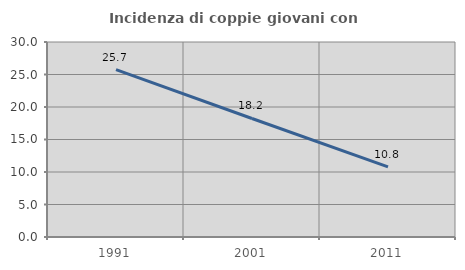
| Category | Incidenza di coppie giovani con figli |
|---|---|
| 1991.0 | 25.746 |
| 2001.0 | 18.232 |
| 2011.0 | 10.785 |